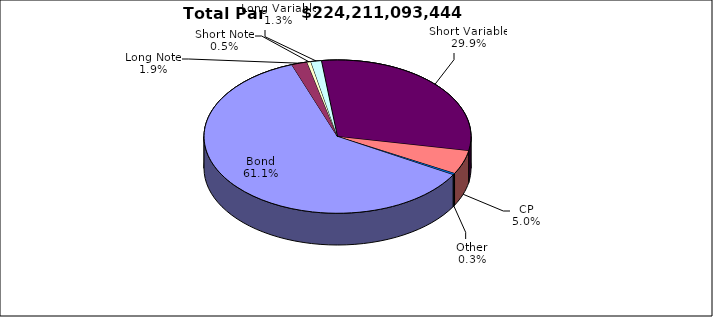
| Category | Par Value |
|---|---|
| Bond | 136990575618 |
| Long Note | 4274939620 |
| Short Note | 1028479574 |
| Long Variable | 2876883000 |
| Short Variable | 67042700895 |
| CP | 11227009000 |
| Other | 770505737 |